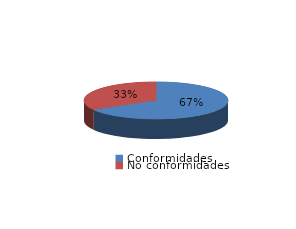
| Category | Series 0 |
|---|---|
| Conformidades | 998 |
| No conformidades | 501 |